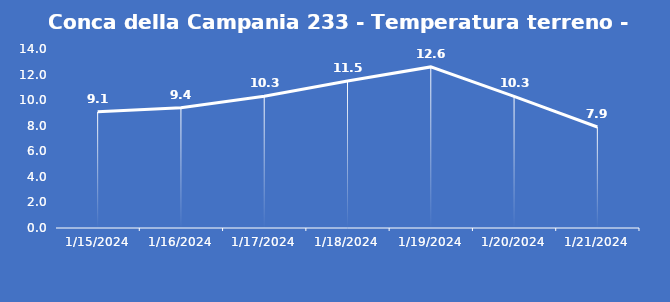
| Category | Conca della Campania 233 - Temperatura terreno - Grezzo (°C) |
|---|---|
| 1/15/24 | 9.1 |
| 1/16/24 | 9.4 |
| 1/17/24 | 10.3 |
| 1/18/24 | 11.5 |
| 1/19/24 | 12.6 |
| 1/20/24 | 10.3 |
| 1/21/24 | 7.9 |